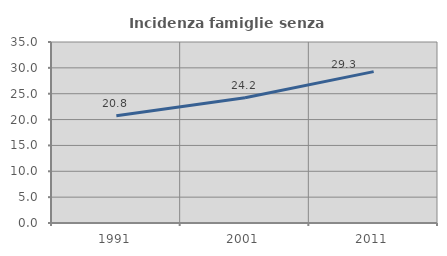
| Category | Incidenza famiglie senza nuclei |
|---|---|
| 1991.0 | 20.751 |
| 2001.0 | 24.235 |
| 2011.0 | 29.268 |